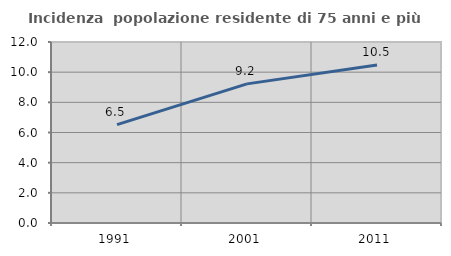
| Category | Incidenza  popolazione residente di 75 anni e più |
|---|---|
| 1991.0 | 6.525 |
| 2001.0 | 9.225 |
| 2011.0 | 10.477 |